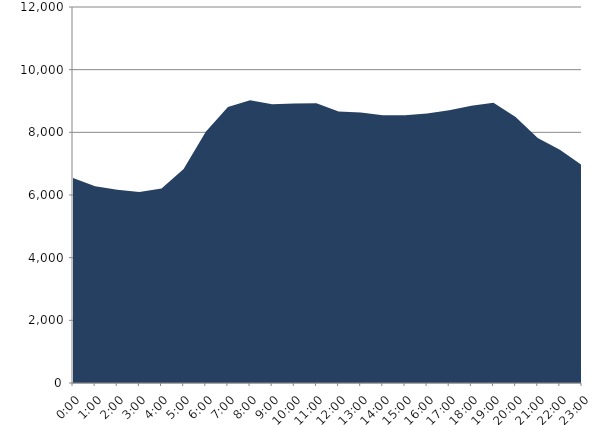
| Category | Series 0 | Series 1 |
|---|---|---|
| 2019-09-18 |  | 6546 |
| 2019-09-18 01:00:00 |  | 6282.77 |
| 2019-09-18 02:00:00 |  | 6164.46 |
| 2019-09-18 03:00:00 |  | 6093.65 |
| 2019-09-18 04:00:00 |  | 6205.17 |
| 2019-09-18 05:00:00 |  | 6830.88 |
| 2019-09-18 06:00:00 |  | 8015.27 |
| 2019-09-18 07:00:00 |  | 8806.68 |
| 2019-09-18 08:00:00 |  | 9020.36 |
| 2019-09-18 09:00:00 |  | 8897.03 |
| 2019-09-18 10:00:00 |  | 8919.44 |
| 2019-09-18 11:00:00 |  | 8927.41 |
| 2019-09-18 12:00:00 |  | 8662.82 |
| 2019-09-18 13:00:00 |  | 8632.94 |
| 2019-09-18 14:00:00 |  | 8546.15 |
| 2019-09-18 15:00:00 |  | 8545.86 |
| 2019-09-18 16:00:00 |  | 8597.27 |
| 2019-09-18 17:00:00 |  | 8706.59 |
| 2019-09-18 18:00:00 |  | 8851.42 |
| 2019-09-18 19:00:00 |  | 8945.27 |
| 2019-09-18 20:00:00 |  | 8491.79 |
| 2019-09-18 21:00:00 |  | 7819.62 |
| 2019-09-18 22:00:00 |  | 7444.54 |
| 2019-09-18 23:00:00 |  | 6953.45 |